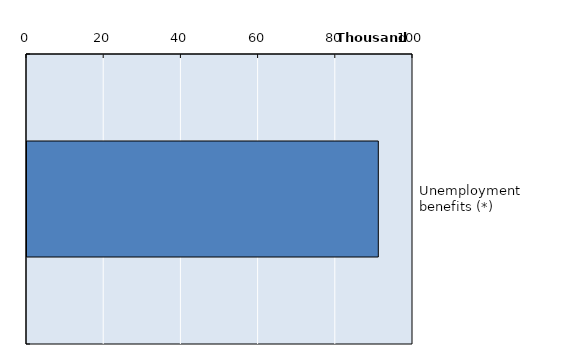
| Category | Series 0 |
|---|---|
| Unemployment benefits (*) | 91011 |